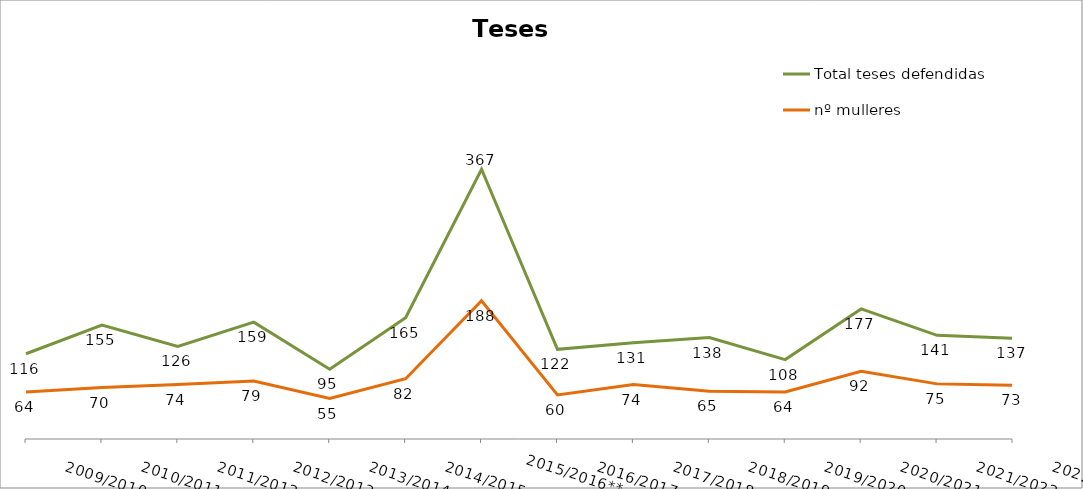
| Category | Total teses defendidas | nº mulleres |
|---|---|---|
| 2009/2010 | 116 | 64 |
| 2010/2011 | 155 | 70 |
| 2011/2012 | 126 | 74 |
| 2012/2013 | 159 | 79 |
| 2013/2014 | 95 | 55 |
| 2014/2015 | 165 | 82 |
| 2015/2016**
 | 367 | 188 |
| 2016/2017 | 122 | 60 |
| 2017/2018 | 131 | 74 |
| 2018/2019 | 138 | 65 |
| 2019/2020 | 108 | 64 |
| 2020/2021 | 177 | 92 |
| 2021/2022 | 141 | 75 |
| 2022/2023 | 137 | 73 |